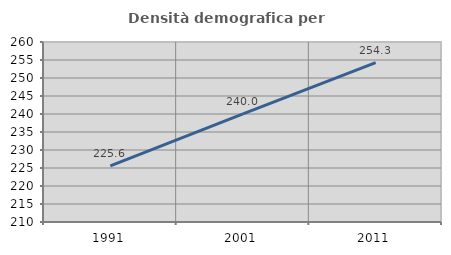
| Category | Densità demografica |
|---|---|
| 1991.0 | 225.609 |
| 2001.0 | 240.047 |
| 2011.0 | 254.299 |